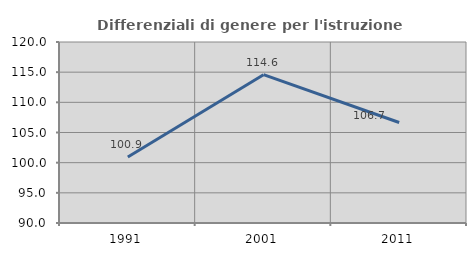
| Category | Differenziali di genere per l'istruzione superiore |
|---|---|
| 1991.0 | 100.929 |
| 2001.0 | 114.579 |
| 2011.0 | 106.659 |